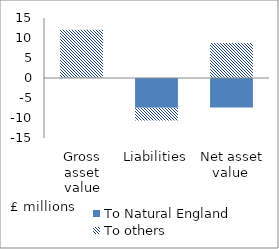
| Category | To Natural England | To others |
|---|---|---|
| Gross asset value | 0.091 | 11.944 |
| Liabilities | -7.443 | -3.163 |
| Net asset value  | -7.352 | 8.781 |